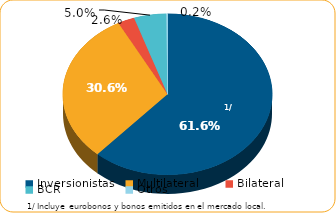
| Category | Series 0 |
|---|---|
| Inversionistas | 8747.8 |
| Multilateral | 4345.3 |
| Bilateral | 367.7 |
| BCR | 704.3 |
| Otros | 29.4 |